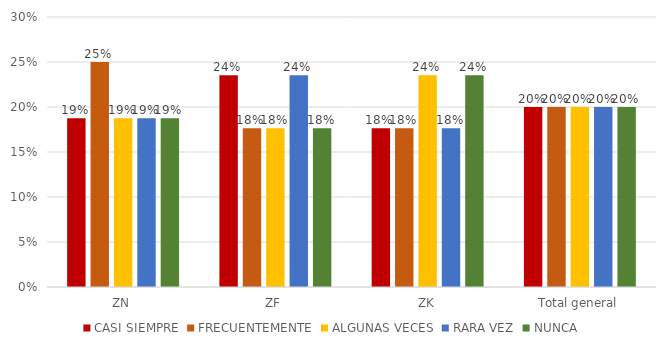
| Category | CASI SIEMPRE | FRECUENTEMENTE | ALGUNAS VECES | RARA VEZ | NUNCA |
|---|---|---|---|---|---|
| ZN | 0.188 | 0.25 | 0.188 | 0.188 | 0.188 |
| ZF | 0.235 | 0.176 | 0.176 | 0.235 | 0.176 |
| ZK | 0.176 | 0.176 | 0.235 | 0.176 | 0.235 |
| Total general | 0.2 | 0.2 | 0.2 | 0.2 | 0.2 |